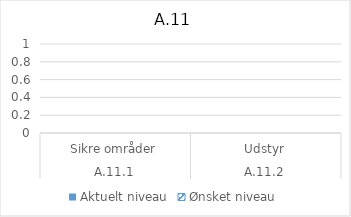
| Category | Aktuelt niveau | Ønsket niveau |
|---|---|---|
| 0 | 0 | 0 |
| 1 | 0 | 0 |